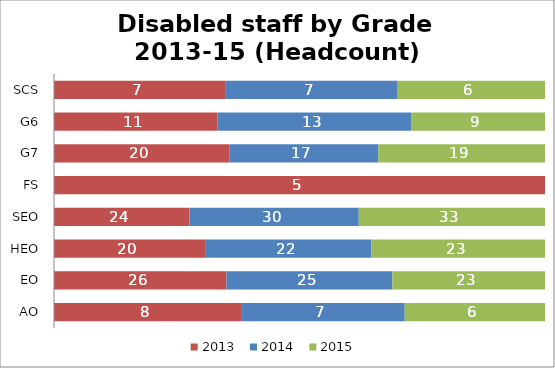
| Category | 2013 | 2014 | 2015 |
|---|---|---|---|
| AO | 8 | 7 | 6 |
| EO | 26 | 25 | 23 |
| HEO | 20 | 22 | 23 |
| SEO | 24 | 30 | 33 |
| FS | 5 | 0 | 0 |
| G7 | 20 | 17 | 19 |
| G6 | 11 | 13 | 9 |
| SCS | 7 | 7 | 6 |